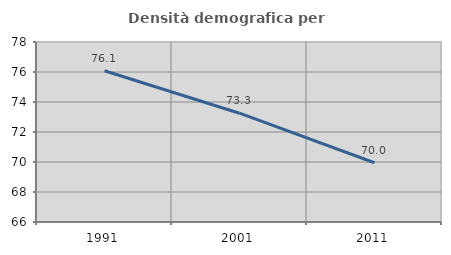
| Category | Densità demografica |
|---|---|
| 1991.0 | 76.083 |
| 2001.0 | 73.253 |
| 2011.0 | 69.952 |